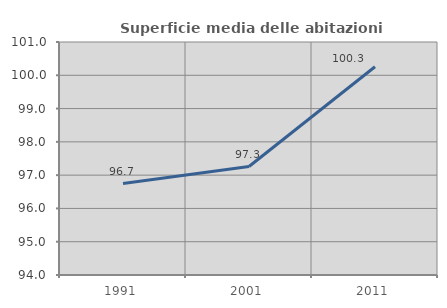
| Category | Superficie media delle abitazioni occupate |
|---|---|
| 1991.0 | 96.746 |
| 2001.0 | 97.258 |
| 2011.0 | 100.258 |